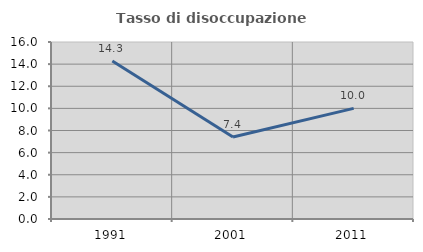
| Category | Tasso di disoccupazione giovanile  |
|---|---|
| 1991.0 | 14.286 |
| 2001.0 | 7.407 |
| 2011.0 | 10 |